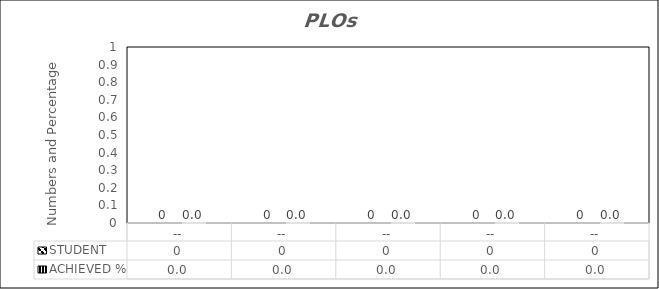
| Category | STUDENT | ACHIEVED % |
|---|---|---|
| -- | 0 | 0 |
| -- | 0 | 0 |
| -- | 0 | 0 |
| -- | 0 | 0 |
| -- | 0 | 0 |